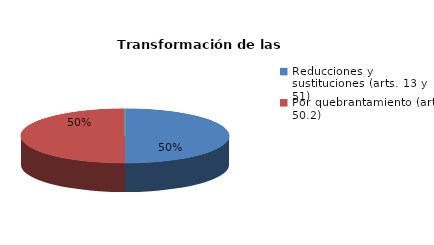
| Category | Series 0 |
|---|---|
| Reducciones y sustituciones (arts. 13 y 51) | 3 |
| Por quebrantamiento (art. 50.2) | 3 |
| Cancelaciones anticipadas | 0 |
| Traslado a Centros Penitenciarios | 0 |
| Conversión internamientos en cerrados (art. 51.2) | 0 |